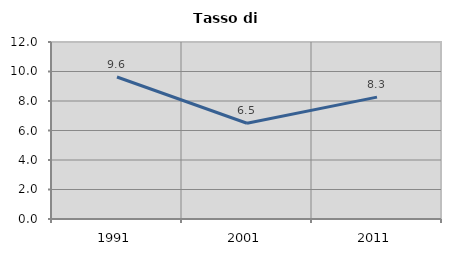
| Category | Tasso di disoccupazione   |
|---|---|
| 1991.0 | 9.625 |
| 2001.0 | 6.494 |
| 2011.0 | 8.264 |